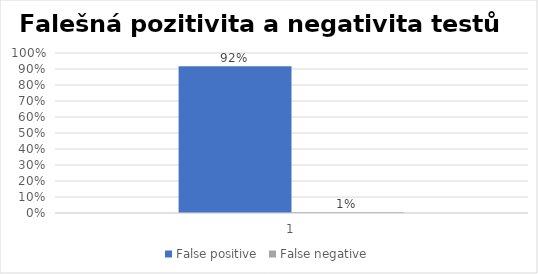
| Category | False positive | False negative |
|---|---|---|
| 0 | 0.917 | 0.006 |